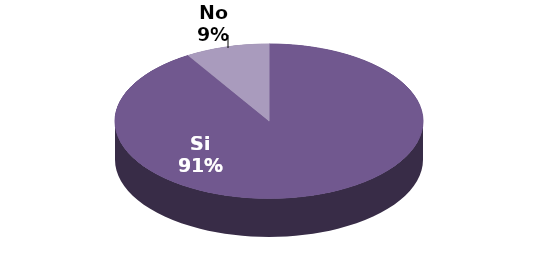
| Category | Series 1 |
|---|---|
| Si | 31 |
| No | 3 |